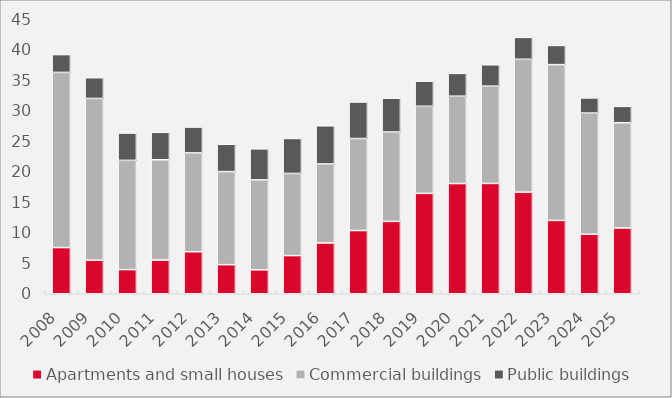
| Category | Apartments and small houses | Commercial buildings | Public buildings |
|---|---|---|---|
| 2008.0 | 7.56 | 28.655 | 2.922 |
| 2009.0 | 5.49 | 26.472 | 3.395 |
| 2010.0 | 3.955 | 17.868 | 4.474 |
| 2011.0 | 5.52 | 16.406 | 4.492 |
| 2012.0 | 6.88 | 16.162 | 4.236 |
| 2013.0 | 4.759 | 15.228 | 4.473 |
| 2014.0 | 3.922 | 14.713 | 5.082 |
| 2015.0 | 6.248 | 13.439 | 5.722 |
| 2016.0 | 8.315 | 12.927 | 6.248 |
| 2017.0 | 10.347 | 15.057 | 5.975 |
| 2018.0 | 11.841 | 14.622 | 5.545 |
| 2019.0 | 16.426 | 14.25 | 4.112 |
| 2020.0 | 18.035 | 14.288 | 3.739 |
| 2021.0 | 18.055 | 15.919 | 3.5 |
| 2022.0 | 16.625 | 21.744 | 3.581 |
| 2023.0 | 11.997 | 25.493 | 3.144 |
| 2024.0 | 9.735 | 19.832 | 2.481 |
| 2025.0 | 10.771 | 17.216 | 2.681 |